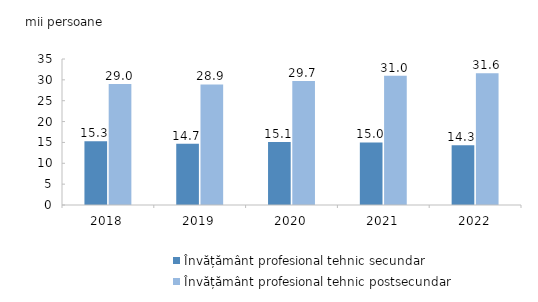
| Category | Învățământ profesional tehnic secundar | Învățământ profesional tehnic postsecundar |
|---|---|---|
| 2018.0 | 15.3 | 29 |
| 2019.0 | 14.7 | 28.9 |
| 2020.0 | 15.1 | 29.7 |
| 2021.0 | 15 | 31 |
| 2022.0 | 14.3 | 31.6 |